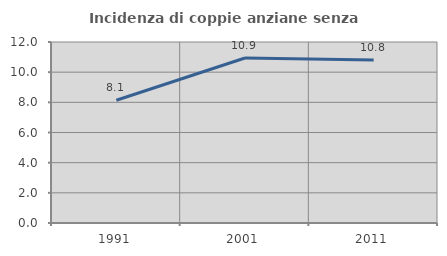
| Category | Incidenza di coppie anziane senza figli  |
|---|---|
| 1991.0 | 8.138 |
| 2001.0 | 10.94 |
| 2011.0 | 10.811 |